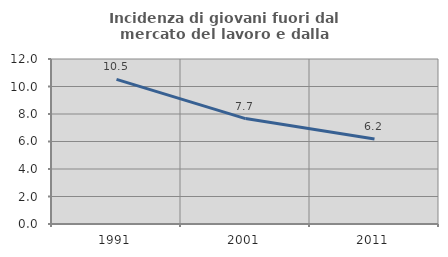
| Category | Incidenza di giovani fuori dal mercato del lavoro e dalla formazione  |
|---|---|
| 1991.0 | 10.519 |
| 2001.0 | 7.668 |
| 2011.0 | 6.183 |